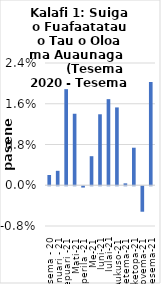
| Category | All items - m-m changes |
|---|---|
| Tesema - 20 | 0.002 |
| Ianuari - 21 | 0.003 |
| Fepuari -21 | 0.019 |
| Mati-21 | 0.014 |
| Aperila -21 | 0 |
| Me-21 | 0.006 |
| Iuni-21 | 0.014 |
| Iulai-21 | 0.017 |
| Aukuso-21 | 0.015 |
| Setema-21 | 0 |
| Oketopa-21 | 0.007 |
| Novema-21 | -0.005 |
| Tesema-21 | 0.02 |